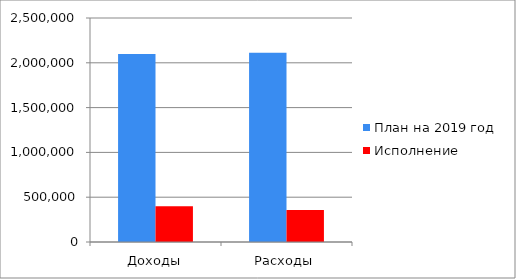
| Category | План на 2019 год | Исполнение |
|---|---|---|
| Доходы | 2099586.63 | 398609.9 |
| Расходы | 2112350.36 | 356702.17 |